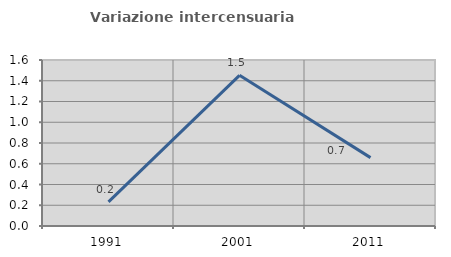
| Category | Variazione intercensuaria annua |
|---|---|
| 1991.0 | 0.232 |
| 2001.0 | 1.453 |
| 2011.0 | 0.659 |